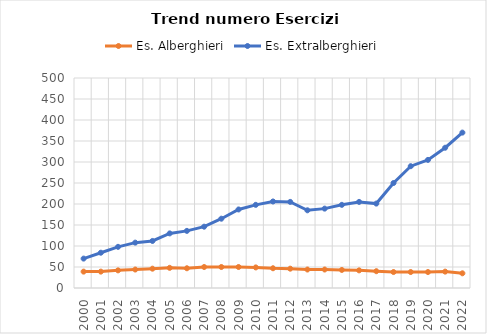
| Category | Es. Alberghieri | Es. Extralberghieri |
|---|---|---|
| 2000.0 | 39 | 70 |
| 2001.0 | 39 | 84 |
| 2002.0 | 42 | 98 |
| 2003.0 | 44 | 108 |
| 2004.0 | 46 | 112 |
| 2005.0 | 48 | 130 |
| 2006.0 | 47 | 136 |
| 2007.0 | 50 | 146 |
| 2008.0 | 50 | 165 |
| 2009.0 | 50 | 187 |
| 2010.0 | 49 | 198 |
| 2011.0 | 47 | 206 |
| 2012.0 | 46 | 205 |
| 2013.0 | 44 | 185 |
| 2014.0 | 44 | 189 |
| 2015.0 | 43 | 198 |
| 2016.0 | 42 | 205 |
| 2017.0 | 40 | 201 |
| 2018.0 | 38 | 250 |
| 2019.0 | 38 | 290 |
| 2020.0 | 38 | 305 |
| 2021.0 | 39 | 334 |
| 2022.0 | 35 | 370 |